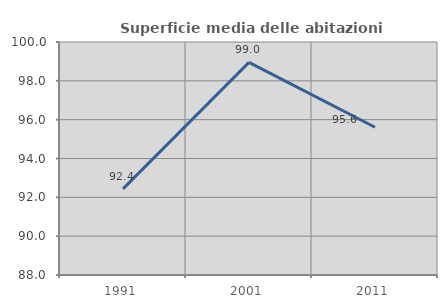
| Category | Superficie media delle abitazioni occupate |
|---|---|
| 1991.0 | 92.437 |
| 2001.0 | 98.954 |
| 2011.0 | 95.609 |